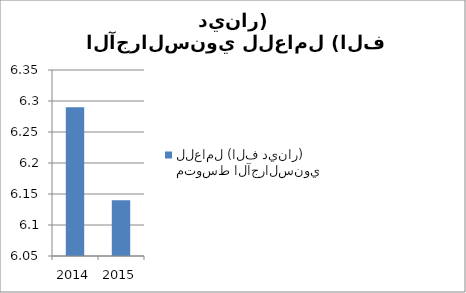
| Category | متوسط الآجرالسنوي للعامل (الف دينار) |
|---|---|
| 2014.0 | 6.29 |
| 2015.0 | 6.14 |